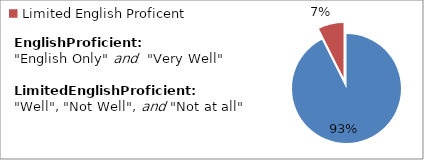
| Category | Percent |
|---|---|
| English Proficient | 0.926 |
| Limited English Proficent | 0.074 |